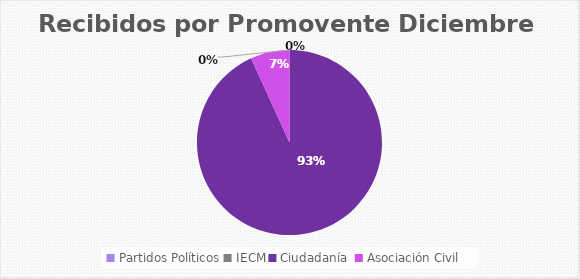
| Category | Recibidos por Promovente DICIEMBRE |
|---|---|
| Partidos Políticos | 0 |
| IECM | 0 |
| Ciudadanía  | 41 |
| Asociación Civil | 3 |